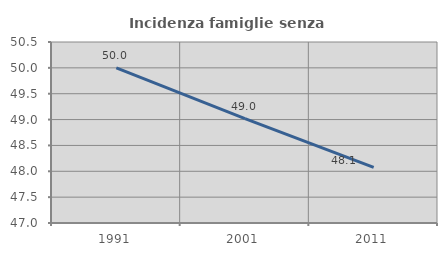
| Category | Incidenza famiglie senza nuclei |
|---|---|
| 1991.0 | 50 |
| 2001.0 | 49.02 |
| 2011.0 | 48.077 |